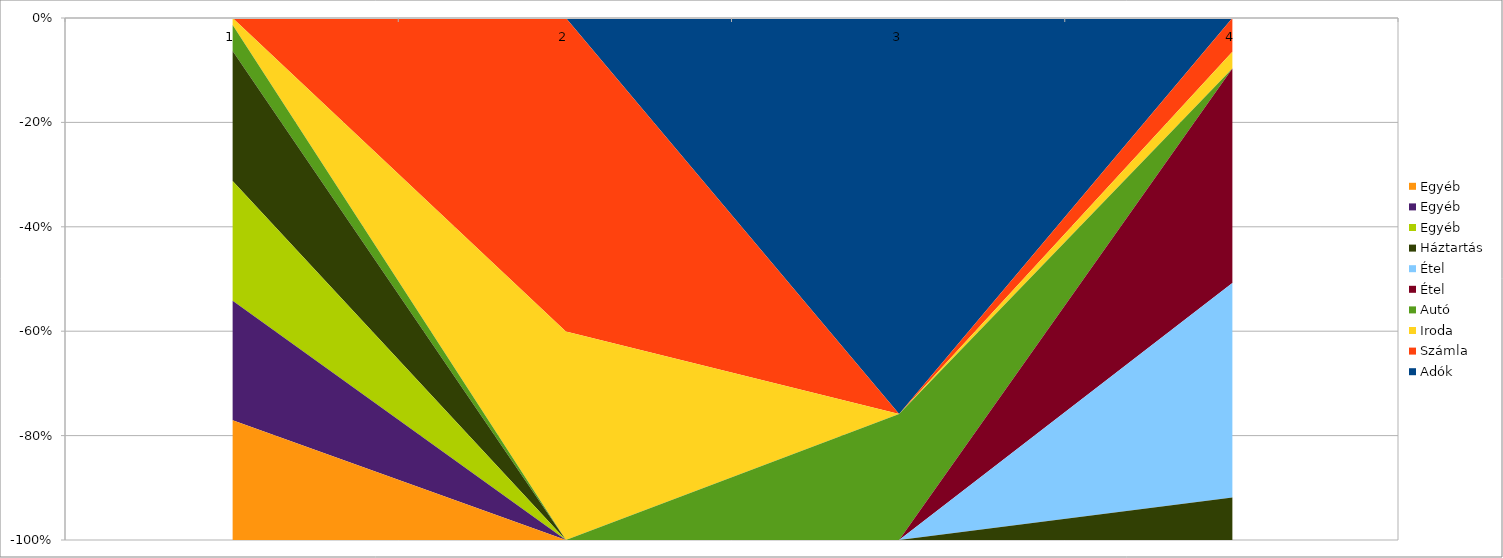
| Category | Adók | Számla | Iroda | Autó | Étel | Háztartás | Egyéb |
|---|---|---|---|---|---|---|---|
| 0 | 0 | 0 | -26.6 | -100 | 0 | -500 | -460 |
| 1 | 0 | -100 | -66.5 | 0 | 0 | 0 | 0 |
| 2 | -220 | 0 | 0 | -70.04 | 0 | 0 | 0 |
| 3 | 0 | -43.94 | -22 | 0 | -280 | -55.6 | 0 |